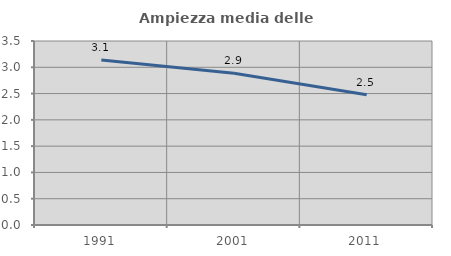
| Category | Ampiezza media delle famiglie |
|---|---|
| 1991.0 | 3.138 |
| 2001.0 | 2.886 |
| 2011.0 | 2.476 |